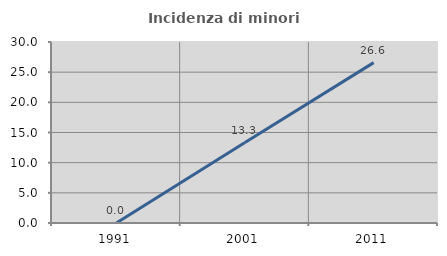
| Category | Incidenza di minori stranieri |
|---|---|
| 1991.0 | 0 |
| 2001.0 | 13.333 |
| 2011.0 | 26.585 |